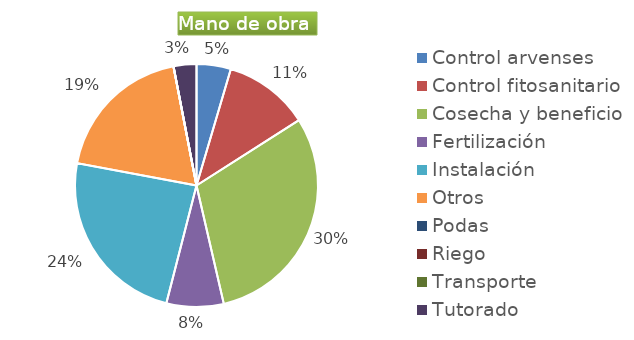
| Category | Series 0 |
|---|---|
| Control arvenses | 671772 |
| Control fitosanitario | 1679430 |
| Cosecha y beneficio | 4478480 |
| Fertilización | 1119620 |
| Instalación | 3526803 |
| Otros | 2799050 |
| Podas | 0 |
| Riego | 0 |
| Transporte | 0 |
| Tutorado | 447848 |